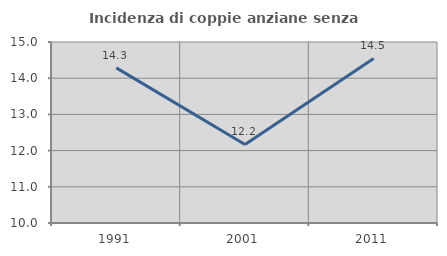
| Category | Incidenza di coppie anziane senza figli  |
|---|---|
| 1991.0 | 14.286 |
| 2001.0 | 12.169 |
| 2011.0 | 14.545 |